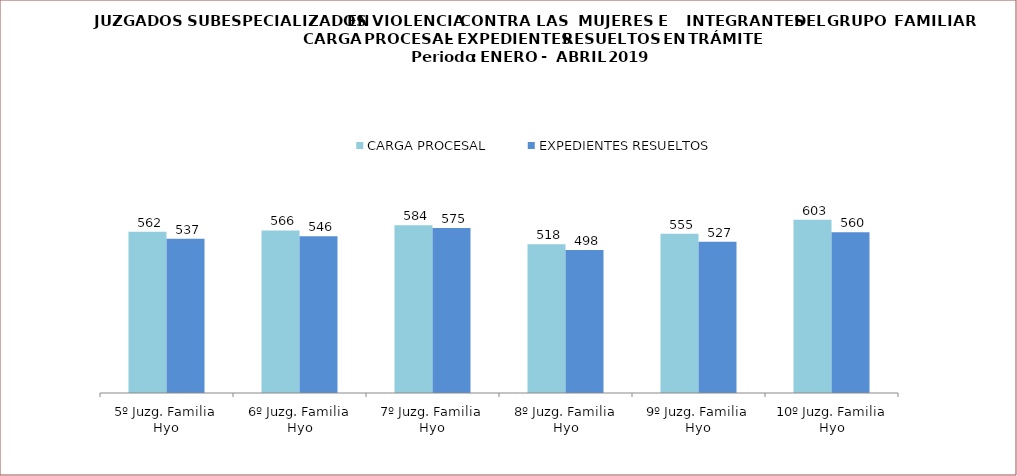
| Category | CARGA PROCESAL | EXPEDIENTES RESUELTOS |
|---|---|---|
| 5º Juzg. Familia Hyo | 562 | 537 |
| 6º Juzg. Familia Hyo | 566 | 546 |
| 7º Juzg. Familia Hyo | 584 | 575 |
| 8º Juzg. Familia Hyo | 518 | 498 |
| 9º Juzg. Familia Hyo | 555 | 527 |
| 10º Juzg. Familia Hyo | 603 | 560 |